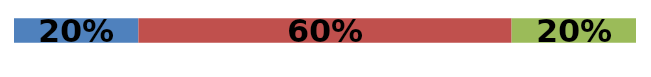
| Category | Series 0 | Series 1 | Series 2 |
|---|---|---|---|
| 0 | 0.2 | 0.6 | 0.2 |